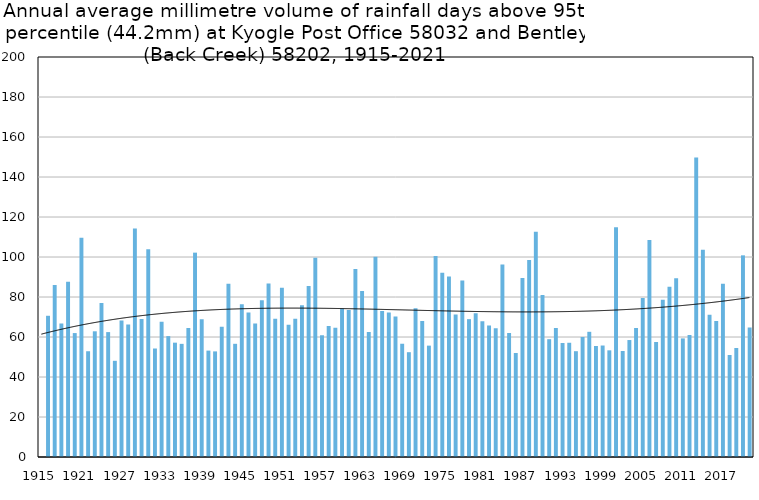
| Category | Annual average mm in days above 95th percentile |
|---|---|
| 1915 | 0 |
| 1916 | 70.614 |
| 1917 | 86.02 |
| 1918 | 66.8 |
| 1919 | 87.65 |
| 1920 | 61.967 |
| 1921 | 109.68 |
| 1922 | 52.883 |
| 1923 | 62.85 |
| 1924 | 77.025 |
| 1925 | 62.45 |
| 1926 | 48.1 |
| 1927 | 68.22 |
| 1928 | 66.22 |
| 1929 | 114.267 |
| 1930 | 69.04 |
| 1931 | 103.867 |
| 1932 | 54.25 |
| 1933 | 67.6 |
| 1934 | 60.443 |
| 1935 | 57.167 |
| 1936 | 56.575 |
| 1937 | 64.529 |
| 1938 | 102.175 |
| 1939 | 68.833 |
| 1940 | 53.2 |
| 1941 | 52.8 |
| 1942 | 65.186 |
| 1943 | 86.633 |
| 1944 | 56.6 |
| 1945 | 76.42 |
| 1946 | 72.275 |
| 1947 | 66.8 |
| 1948 | 78.412 |
| 1949 | 86.767 |
| 1950 | 69.129 |
| 1951 | 84.657 |
| 1952 | 66.067 |
| 1953 | 69.111 |
| 1954 | 75.933 |
| 1955 | 85.538 |
| 1956 | 99.586 |
| 1957 | 60.875 |
| 1958 | 65.467 |
| 1959 | 64.57 |
| 1960 | 74.2 |
| 1961 | 73.55 |
| 1962 | 94.044 |
| 1963 | 82.943 |
| 1964 | 62.5 |
| 1965 | 100.143 |
| 1966 | 72.95 |
| 1967 | 72.3 |
| 1968 | 70.267 |
| 1969 | 56.633 |
| 1970 | 52.4 |
| 1971 | 74.433 |
| 1972 | 68 |
| 1973 | 55.683 |
| 1974 | 100.457 |
| 1975 | 92.164 |
| 1976 | 90.217 |
| 1977 | 71.2 |
| 1978 | 88.24 |
| 1979 | 68.925 |
| 1980 | 71.92 |
| 1981 | 67.88 |
| 1982 | 65.7 |
| 1983 | 64.4 |
| 1984 | 96.2 |
| 1985 | 62 |
| 1986 | 52 |
| 1987 | 89.5 |
| 1988 | 98.5 |
| 1989 | 112.6 |
| 1990 | 81 |
| 1991 | 58.9 |
| 1992 | 64.5 |
| 1993 | 57 |
| 1994 | 57.12 |
| 1995 | 52.9 |
| 1996 | 60 |
| 1997 | 62.6 |
| 1998 | 55.5 |
| 1999 | 55.743 |
| 2000 | 53.333 |
| 2001 | 114.875 |
| 2002 | 53 |
| 2003 | 58.48 |
| 2004 | 64.56 |
| 2005 | 79.5 |
| 2006 | 108.475 |
| 2007 | 57.5 |
| 2008 | 78.657 |
| 2009 | 85.075 |
| 2010 | 89.433 |
| 2011 | 59.3 |
| 2012 | 61 |
| 2013 | 149.8 |
| 2014 | 103.667 |
| 2015 | 71.075 |
| 2016 | 68 |
| 2017 | 86.625 |
| 2018 | 51 |
| 2019 | 54.5 |
| 2020 | 100.833 |
| 2021 | 64.8 |